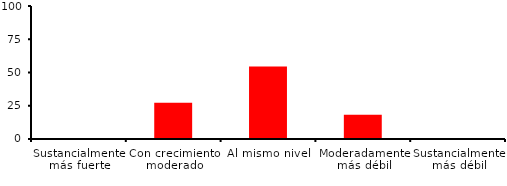
| Category | Series 0 |
|---|---|
| Sustancialmente más fuerte | 0 |
| Con crecimiento moderado | 27.273 |
| Al mismo nivel | 54.545 |
| Moderadamente más débil | 18.182 |
| Sustancialmente más débil | 0 |